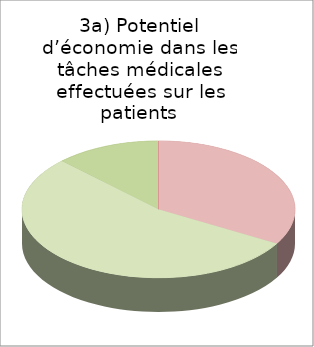
| Category | Tâches médicales effectuées sur les patients |
|---|---|
| élevé | 0 |
| moyen | 8 |
| faible | 13 |
| aucun | 3 |